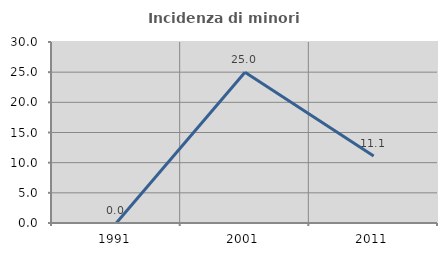
| Category | Incidenza di minori stranieri |
|---|---|
| 1991.0 | 0 |
| 2001.0 | 25 |
| 2011.0 | 11.111 |